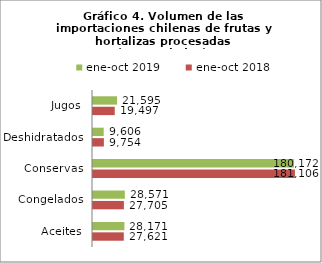
| Category | ene-oct 2018 | ene-oct 2019 |
|---|---|---|
| Aceites | 27620631.544 | 28170854.103 |
| Congelados | 27705126.919 | 28571149.822 |
| Conservas | 181106242.668 | 180172368.787 |
| Deshidratados | 9754121.809 | 9606285.815 |
| Jugos | 19497118.839 | 21594646.643 |